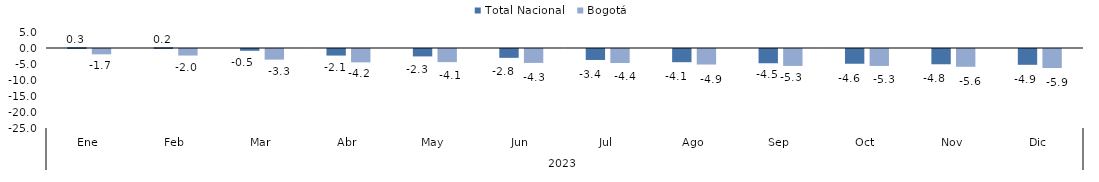
| Category | Total Nacional | Bogotá |
|---|---|---|
| 0 | 0.259 | -1.667 |
| 1 | 0.234 | -2.043 |
| 2 | -0.548 | -3.32 |
| 3 | -2.053 | -4.182 |
| 4 | -2.316 | -4.103 |
| 5 | -2.761 | -4.343 |
| 6 | -3.426 | -4.385 |
| 7 | -4.124 | -4.853 |
| 8 | -4.451 | -5.29 |
| 9 | -4.605 | -5.292 |
| 10 | -4.772 | -5.562 |
| 11 | -4.938 | -5.941 |